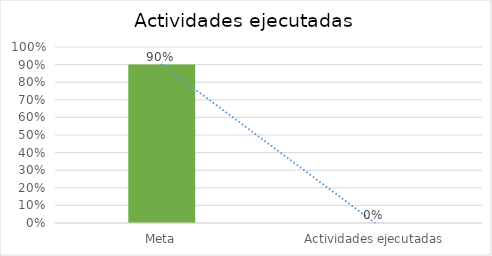
| Category | Series 0 |
|---|---|
| Meta | 0.9 |
| Actividades ejecutadas | 0 |